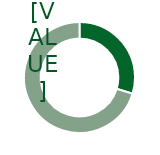
| Category | Series 0 |
|---|---|
| 0 | 0.297 |
| 1 | 0.703 |